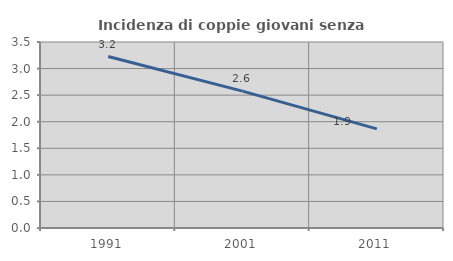
| Category | Incidenza di coppie giovani senza figli |
|---|---|
| 1991.0 | 3.226 |
| 2001.0 | 2.575 |
| 2011.0 | 1.865 |